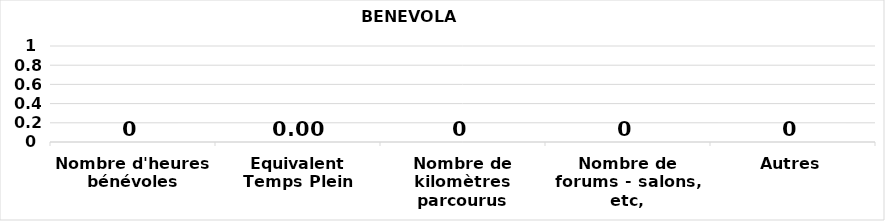
| Category | BENEVOLAT |
|---|---|
| Nombre d'heures bénévoles | 0 |
| Equivalent Temps Plein | 0 |
| Nombre de kilomètres parcourus | 0 |
| Nombre de forums - salons, etc, | 0 |
| Autres | 0 |